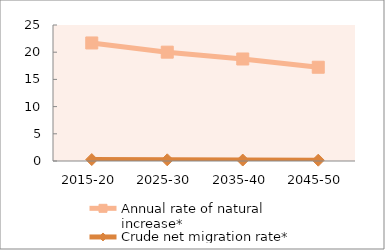
| Category | Annual rate of natural increase* | Crude net migration rate* |
|---|---|---|
| 2015-20 | 21.697 | 0.266 |
| 2025-30 | 20.007 | 0.216 |
| 2035-40 | 18.751 | 0.177 |
| 2045-50 | 17.234 | 0.148 |